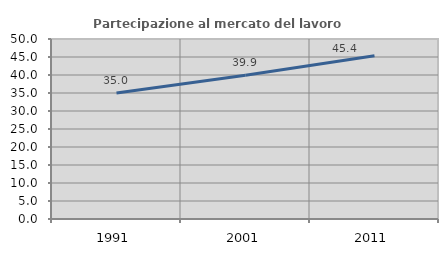
| Category | Partecipazione al mercato del lavoro  femminile |
|---|---|
| 1991.0 | 34.972 |
| 2001.0 | 39.932 |
| 2011.0 | 45.368 |